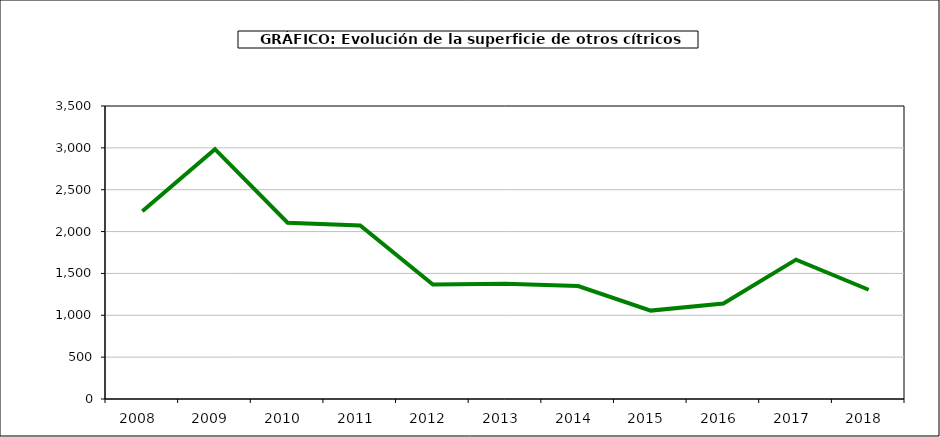
| Category | superficie |
|---|---|
| 2008.0 | 2242 |
| 2009.0 | 2984 |
| 2010.0 | 2106 |
| 2011.0 | 2074 |
| 2012.0 | 1368 |
| 2013.0 | 1377 |
| 2014.0 | 1349 |
| 2015.0 | 1056 |
| 2016.0 | 1140 |
| 2017.0 | 1665 |
| 2018.0 | 1305 |